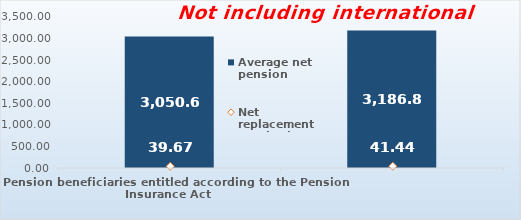
| Category | Average net pension  |
|---|---|
| Pension beneficiaries entitled according to the Pension Insurance Act   | 3050.61 |
| Pension beneficiaries entitled to pension FOR THE FIRST TIME in 2022 according to the Pension Insurance Act  - NEW BENEFICIARIES | 3186.881 |